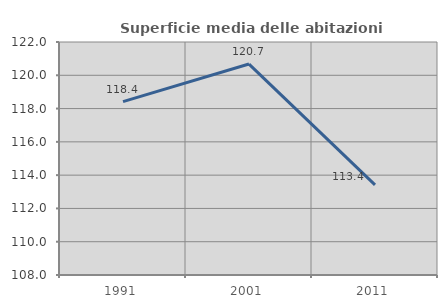
| Category | Superficie media delle abitazioni occupate |
|---|---|
| 1991.0 | 118.417 |
| 2001.0 | 120.675 |
| 2011.0 | 113.419 |